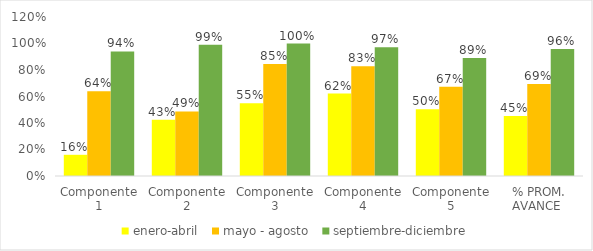
| Category | enero-abril  | mayo - agosto  | septiembre-diciembre |
|---|---|---|---|
| Componente 1 | 0.16 | 0.64 | 0.94 |
| Componente 2 | 0.425 | 0.488 | 0.99 |
| Componente 3 | 0.55 | 0.846 | 1 |
| Componente 4 | 0.622 | 0.828 | 0.972 |
| Componente 5 | 0.505 | 0.673 | 0.89 |
| % PROM. AVANCE  | 0.452 | 0.695 | 0.958 |